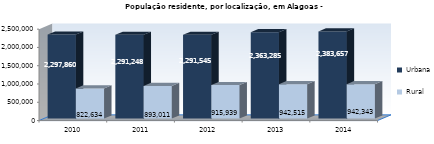
| Category | Urbana | Rural |
|---|---|---|
| 2010.0 | 2297860 | 822634 |
| 2011.0 | 2291248 | 893011 |
| 2012.0 | 2291545 | 915939 |
| 2013.0 | 2363285 | 942515 |
| 2014.0 | 2383657 | 942343 |